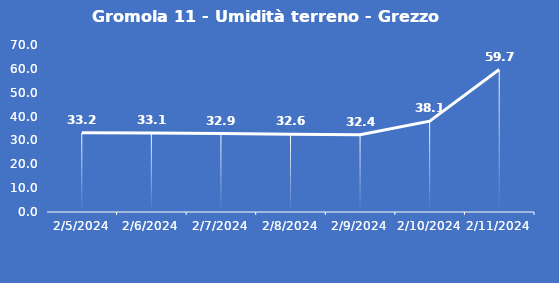
| Category | Gromola 11 - Umidità terreno - Grezzo (%VWC) |
|---|---|
| 2/5/24 | 33.2 |
| 2/6/24 | 33.1 |
| 2/7/24 | 32.9 |
| 2/8/24 | 32.6 |
| 2/9/24 | 32.4 |
| 2/10/24 | 38.1 |
| 2/11/24 | 59.7 |